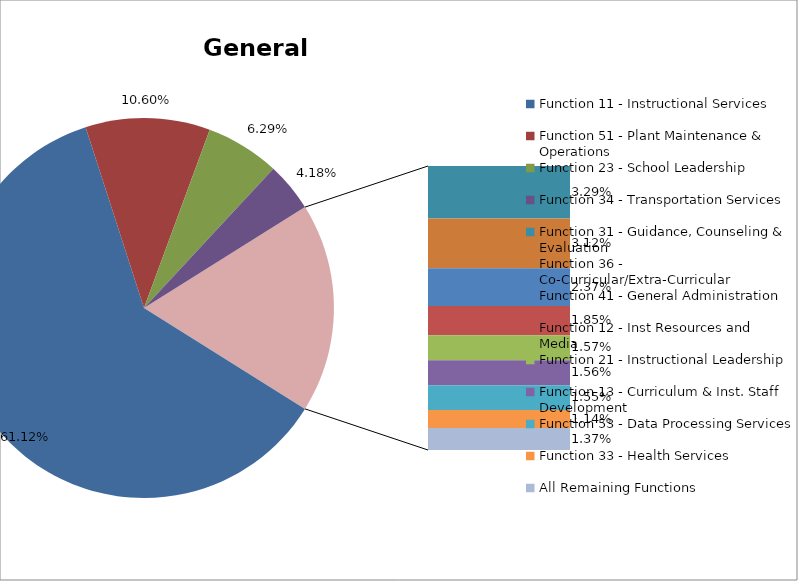
| Category | Series 0 |
|---|---|
| Function 11 - Instructional Services | 0.611 |
| Function 51 - Plant Maintenance & Operations | 0.106 |
| Function 23 - School Leadership | 0.063 |
| Function 34 - Transportation Services | 0.042 |
| Function 31 - Guidance, Counseling & Evaluation | 0.033 |
| Function 36 - Co-Curricular/Extra-Curricular | 0.031 |
| Function 41 - General Administration | 0.024 |
| Function 12 - Inst Resources and Media | 0.018 |
| Function 21 - Instructional Leadership | 0.016 |
| Function 13 - Curriculum & Inst. Staff Development | 0.016 |
| Function 53 - Data Processing Services | 0.016 |
| Function 33 - Health Services | 0.011 |
| All Remaining Functions | 0.014 |